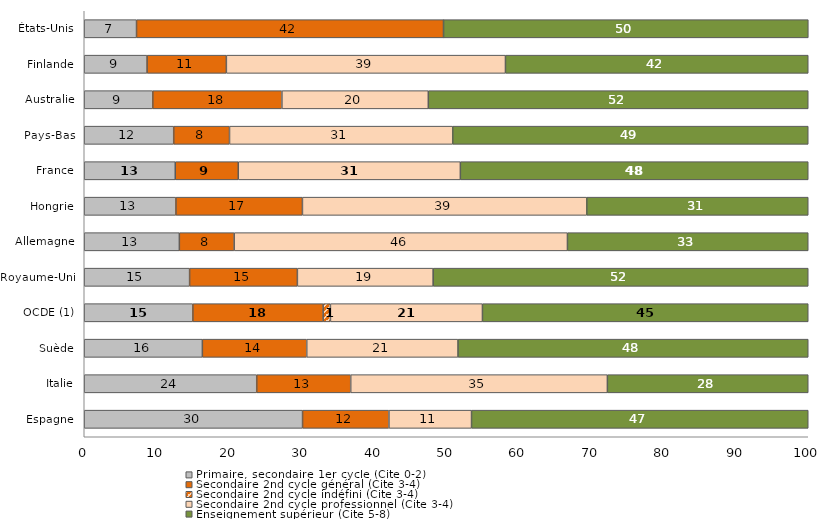
| Category | Primaire, secondaire 1er cycle (Cite 0-2) | Secondaire 2nd cycle général (Cite 3-4) | Secondaire 2nd cycle indéfini (Cite 3-4) | Secondaire 2nd cycle professionnel (Cite 3-4) | Enseignement supérieur (Cite 5-8) |
|---|---|---|---|---|---|
| Espagne | 30.153 | 11.93 | 0 | 11.409 | 46.508 |
| Italie | 23.823 | 12.982 | 0 | 35.451 | 27.745 |
| Suède | 16.315 | 14.416 | 0 | 20.895 | 48.373 |
| OCDE (1) | 15 | 18 | 1 | 21 | 45 |
| Royaume-Uni | 14.552 | 14.886 | 0 | 18.752 | 51.81 |
| Allemagne | 13.136 | 7.572 | 0 | 46.031 | 33.26 |
| Hongrie | 12.66 | 17.474 | 0 | 39.277 | 30.589 |
| France | 12.569 | 8.705 | 0 | 30.673 | 48.053 |
| Pays-Bas | 12.356 | 7.71 | 0 | 30.831 | 49.103 |
| Australie | 9.468 | 17.833 | 0 | 20.221 | 52.478 |
| Finlande | 8.677 | 10.953 | 0 | 38.549 | 41.821 |
| États-Unis | 7.22 | 42.4 | 0 | 0.01 | 50.38 |